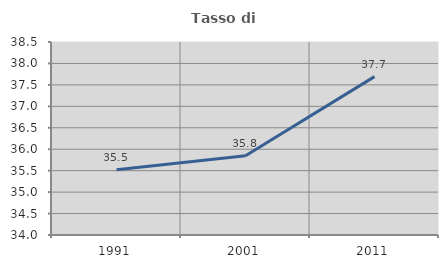
| Category | Tasso di occupazione   |
|---|---|
| 1991.0 | 35.522 |
| 2001.0 | 35.849 |
| 2011.0 | 37.693 |